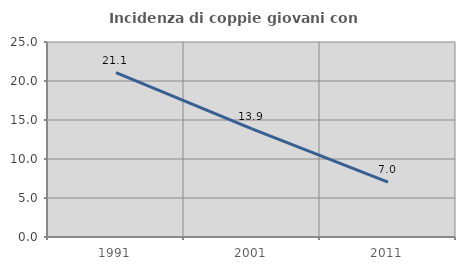
| Category | Incidenza di coppie giovani con figli |
|---|---|
| 1991.0 | 21.065 |
| 2001.0 | 13.874 |
| 2011.0 | 7.044 |